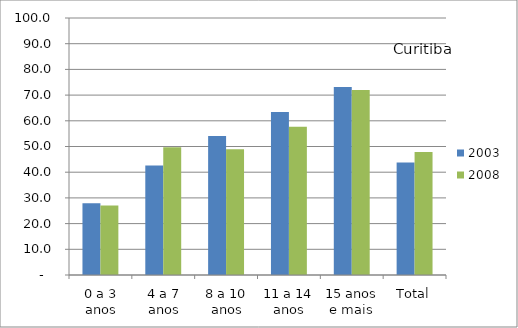
| Category | 2003 | 2008 |
|---|---|---|
| 0 a 3 anos | 27.95 | 27.06 |
| 4 a 7 anos | 42.57 | 49.73 |
| 8 a 10 anos | 54.09 | 48.91 |
| 11 a 14 anos | 63.41 | 57.69 |
| 15 anos e mais | 73.17 | 72 |
| Total | 43.73 | 47.86 |